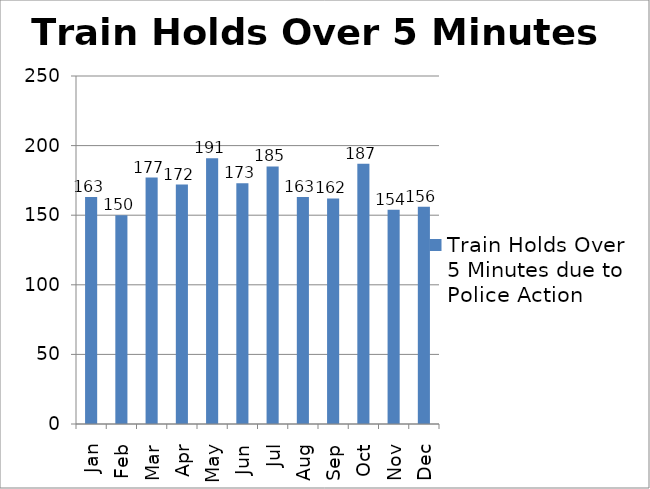
| Category | Train Holds Over 5 Minutes due to Police Action |
|---|---|
| Jan | 163 |
| Feb | 150 |
| Mar | 177 |
| Apr | 172 |
| May | 191 |
| Jun | 173 |
| Jul | 185 |
| Aug | 163 |
| Sep | 162 |
| Oct | 187 |
| Nov | 154 |
| Dec | 156 |